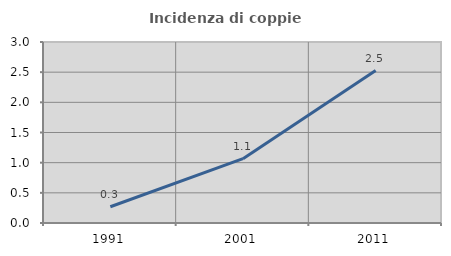
| Category | Incidenza di coppie miste |
|---|---|
| 1991.0 | 0.269 |
| 2001.0 | 1.066 |
| 2011.0 | 2.526 |